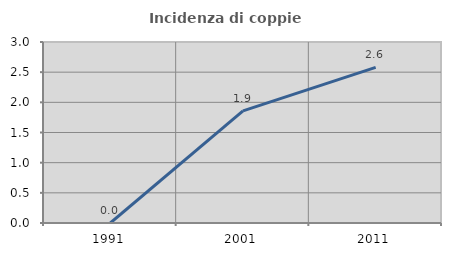
| Category | Incidenza di coppie miste |
|---|---|
| 1991.0 | 0 |
| 2001.0 | 1.858 |
| 2011.0 | 2.579 |